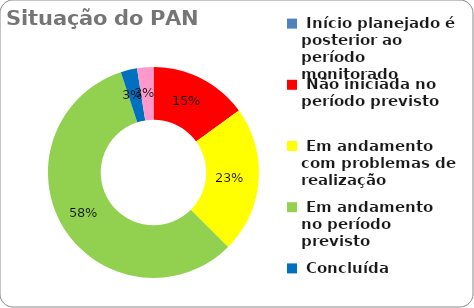
| Category | Series 0 |
|---|---|
|  Início planejado é posterior ao período monitorado | 0 |
|  Não iniciada no período previsto | 0.15 |
|  Em andamento com problemas de realização | 0.225 |
|  Em andamento no período previsto  | 0.575 |
|  Concluída | 0.025 |
|  Ações Novas - Pós monitoria | 0.025 |